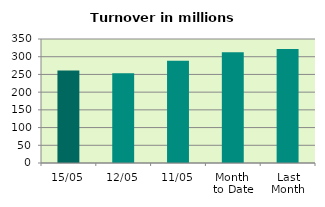
| Category | Series 0 |
|---|---|
| 15/05 | 261.21 |
| 12/05 | 253.374 |
| 11/05 | 288.417 |
| Month 
to Date | 312.912 |
| Last
Month | 322.024 |